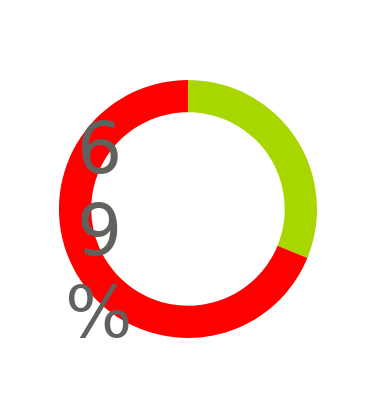
| Category | Series 0 |
|---|---|
| 0 | 0.312 |
| 1 | 0.688 |